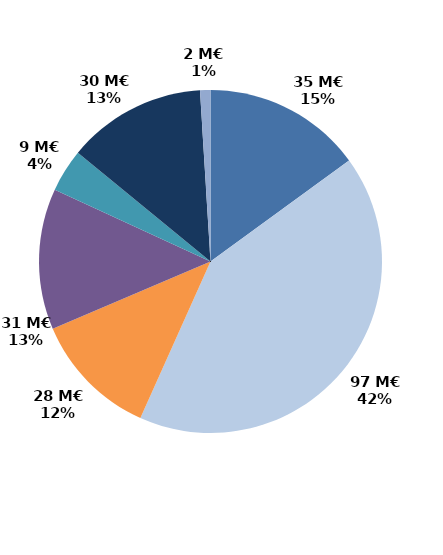
| Category | Series 0 |
|---|---|
| Accueil et information (CEP 1) | 34.876 |
| Accompagnement renforcé (CEP 2 et 3) | 97.201 |
| Suivi | 27.68 |
| Missions locales | 30.964 |
| CSP | 9.425 |
| Aide à la création d'entreprise | 30.495 |
| Aide à l'insertion | 2.28 |